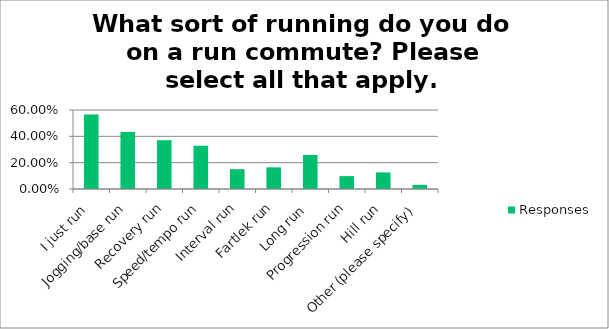
| Category | Responses |
|---|---|
| I just run | 0.566 |
| Jogging/base run | 0.434 |
| Recovery run | 0.371 |
| Speed/tempo run | 0.329 |
| Interval run | 0.15 |
| Fartlek run | 0.164 |
| Long run | 0.259 |
| Progression run | 0.098 |
| Hill run | 0.126 |
| Other (please specify) | 0.032 |